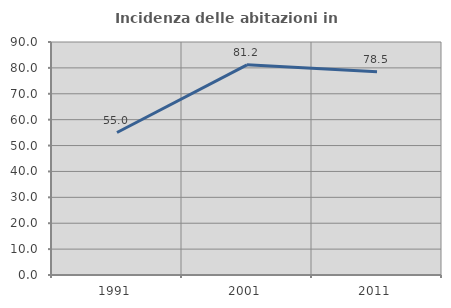
| Category | Incidenza delle abitazioni in proprietà  |
|---|---|
| 1991.0 | 55.038 |
| 2001.0 | 81.18 |
| 2011.0 | 78.511 |